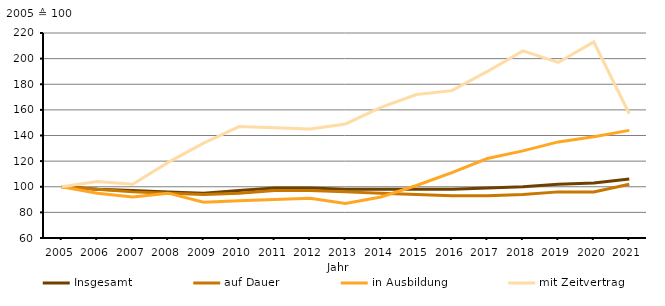
| Category | Insgesamt | auf Dauer | in Ausbildung | mit Zeitvertrag |
|---|---|---|---|---|
| 2005.0 | 100 | 100 | 100 | 100 |
| 2006.0 | 98 | 98 | 95 | 104 |
| 2007.0 | 97 | 96 | 92 | 102 |
| 2008.0 | 96 | 95 | 95 | 119 |
| 2009.0 | 95 | 94 | 88 | 134 |
| 2010.0 | 97 | 95 | 89 | 147 |
| 2011.0 | 99 | 97 | 90 | 146 |
| 2012.0 | 99 | 97 | 91 | 145 |
| 2013.0 | 98 | 96 | 87 | 149 |
| 2014.0 | 98 | 95 | 92 | 162 |
| 2015.0 | 98 | 94 | 101 | 172 |
| 2016.0 | 98 | 93 | 111 | 175 |
| 2017.0 | 99 | 93 | 122 | 190 |
| 2018.0 | 100 | 94 | 128 | 206 |
| 2019.0 | 102 | 96 | 135 | 197 |
| 2020.0 | 103 | 96 | 139 | 213 |
| 2021.0 | 106 | 102 | 144 | 157 |